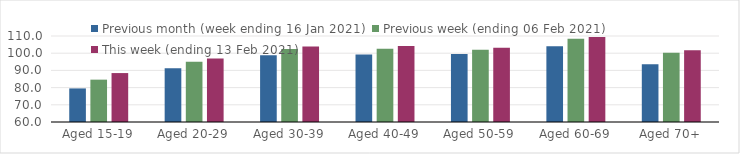
| Category | Previous month (week ending 16 Jan 2021) | Previous week (ending 06 Feb 2021) | This week (ending 13 Feb 2021) |
|---|---|---|---|
| Aged 15-19 | 79.52 | 84.62 | 88.45 |
| Aged 20-29 | 91.32 | 95.02 | 96.98 |
| Aged 30-39 | 98.83 | 102.42 | 103.84 |
| Aged 40-49 | 99.26 | 102.54 | 104.13 |
| Aged 50-59 | 99.52 | 102.05 | 103.18 |
| Aged 60-69 | 104 | 108.37 | 109.4 |
| Aged 70+ | 93.56 | 100.25 | 101.68 |